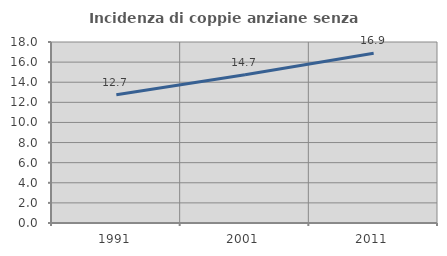
| Category | Incidenza di coppie anziane senza figli  |
|---|---|
| 1991.0 | 12.747 |
| 2001.0 | 14.735 |
| 2011.0 | 16.883 |